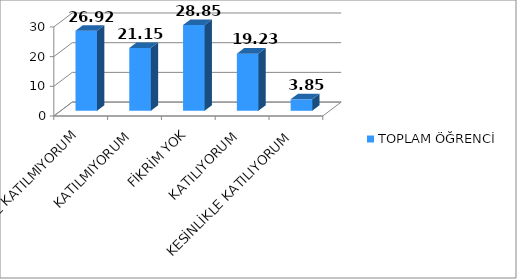
| Category | TOPLAM ÖĞRENCİ |
|---|---|
| KESİNLİKLE KATILMIYORUM | 26.92 |
| KATILMIYORUM | 21.15 |
| FİKRİM YOK | 28.85 |
| KATILIYORUM | 19.23 |
| KESİNLİKLE KATILIYORUM | 3.85 |